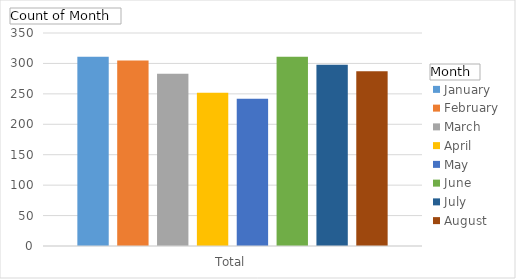
| Category | January | February | March | April | May | June | July | August |
|---|---|---|---|---|---|---|---|---|
| Total | 311 | 305 | 283 | 252 | 242 | 311 | 298 | 287 |